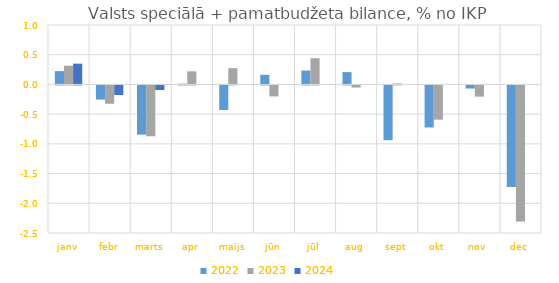
| Category | 2022 | 2023 | 2024 |
|---|---|---|---|
| janv | 0.224 | 0.315 | 0.349 |
| febr | -0.238 | -0.309 | -0.161 |
| marts | -0.828 | -0.856 | -0.077 |
| apr | 0.012 | 0.22 | 0 |
| maijs | -0.413 | 0.274 | 0 |
| jūn | 0.162 | -0.185 | 0 |
| jūl | 0.234 | 0.441 | 0 |
| aug | 0.207 | -0.035 | 0 |
| sept | -0.921 | 0.016 | 0 |
| okt | -0.707 | -0.576 | 0 |
| nov | -0.052 | -0.189 | 0 |
| dec | -1.707 | -2.289 | 0 |